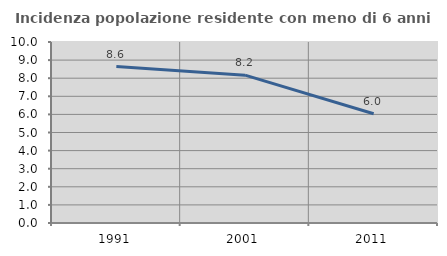
| Category | Incidenza popolazione residente con meno di 6 anni |
|---|---|
| 1991.0 | 8.644 |
| 2001.0 | 8.167 |
| 2011.0 | 6.036 |